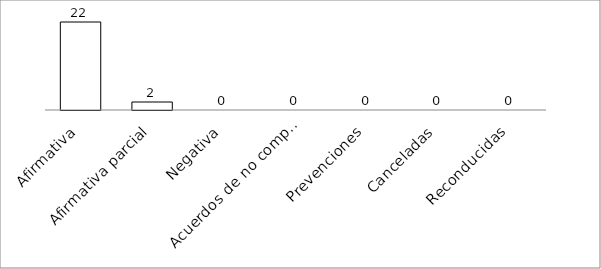
| Category | Series 0 |
|---|---|
| Afirmativa | 22 |
| Afirmativa parcial | 2 |
| Negativa | 0 |
| Acuerdos de no competencia | 0 |
| Prevenciones | 0 |
| Canceladas | 0 |
| Reconducidas | 0 |